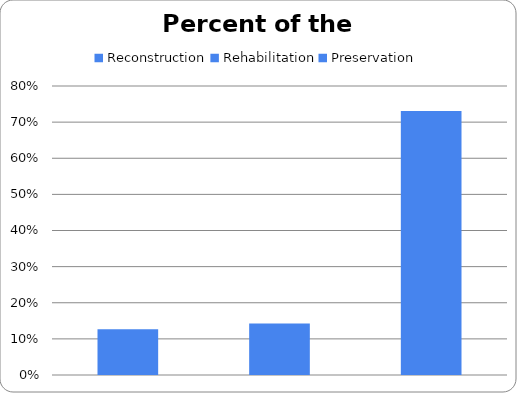
| Category | Series 0 |
|---|---|
| Reconstruction | 0.127 |
| Rehabilitation | 0.143 |
| Preservation | 0.731 |